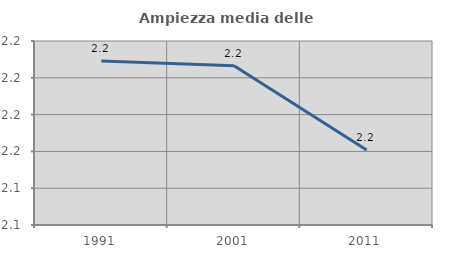
| Category | Ampiezza media delle famiglie |
|---|---|
| 1991.0 | 2.209 |
| 2001.0 | 2.207 |
| 2011.0 | 2.161 |